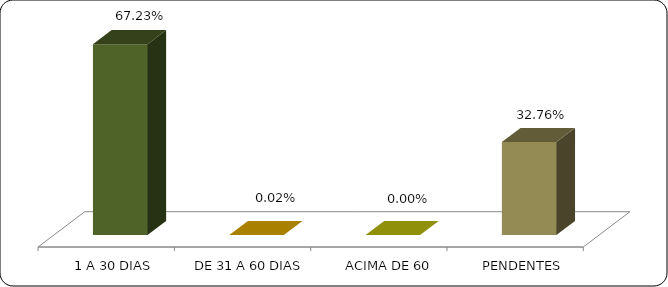
| Category | Series 0 |
|---|---|
|      1 A 30 DIAS | 0.672 |
|      DE 31 A 60 DIAS | 0 |
|      ACIMA DE 60 DIAS | 0 |
|      PENDENTES | 0.328 |